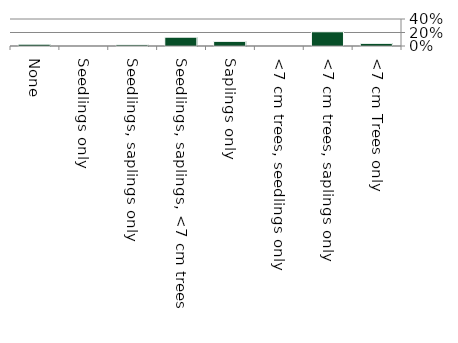
| Category | Native |
|---|---|
| None | 0.028 |
| Seedlings only | 0 |
| Seedlings, saplings only | 0.018 |
| Seedlings, saplings, <7 cm trees | 0.131 |
| Saplings only | 0.069 |
| <7 cm trees, seedlings only | 0 |
| <7 cm trees, saplings only | 0.211 |
| <7 cm Trees only | 0.039 |